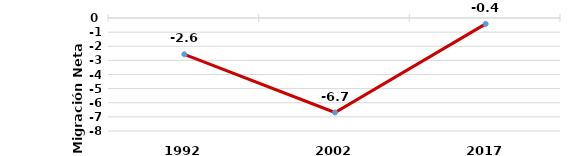
| Category | Series 0 |
|---|---|
| 1992.0 | -2.571 |
| 2002.0 | -6.69 |
| 2017.0 | -0.416 |